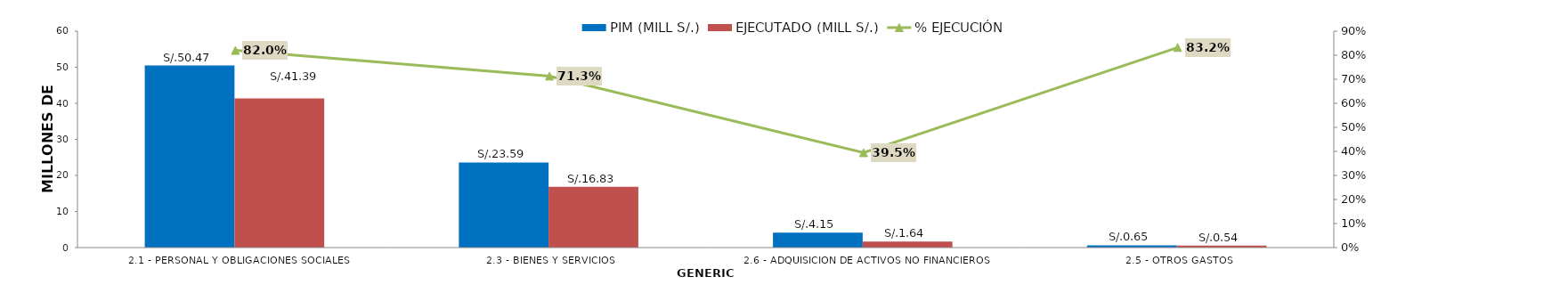
| Category | PIM (MILL S/.) | EJECUTADO (MILL S/.) |
|---|---|---|
| 2.1 - PERSONAL Y OBLIGACIONES SOCIALES | 50.472 | 41.387 |
| 2.3 - BIENES Y SERVICIOS | 23.59 | 16.826 |
| 2.6 - ADQUISICION DE ACTIVOS NO FINANCIEROS | 4.147 | 1.636 |
| 2.5 - OTROS GASTOS | 0.647 | 0.538 |